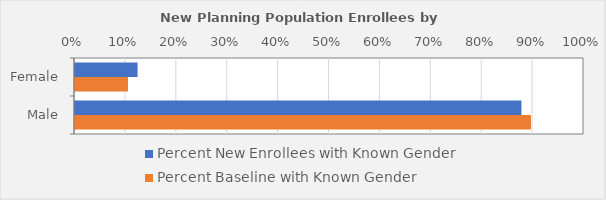
| Category | Percent New Enrollees with Known Gender | Percent Baseline with Known Gender |
|---|---|---|
| Female | 0.123 | 0.104 |
| Male | 0.877 | 0.896 |